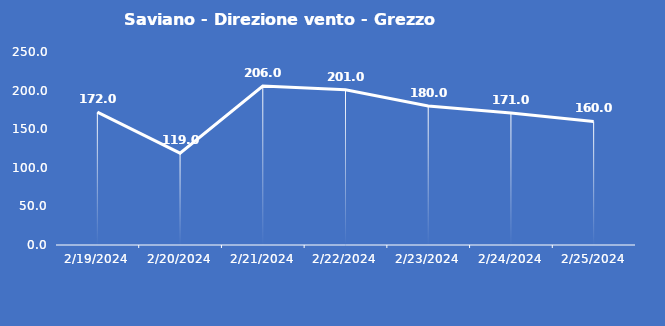
| Category | Saviano - Direzione vento - Grezzo (°N) |
|---|---|
| 2/19/24 | 172 |
| 2/20/24 | 119 |
| 2/21/24 | 206 |
| 2/22/24 | 201 |
| 2/23/24 | 180 |
| 2/24/24 | 171 |
| 2/25/24 | 160 |